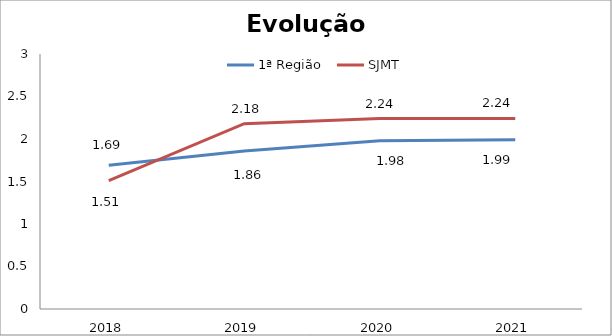
| Category | 1ª Região | SJMT |
|---|---|---|
| 0 | 1.69 | 1.51 |
| 1 | 1.86 | 2.18 |
| 2 | 1.98 | 2.24 |
| 3 | 1.99 | 2.24 |